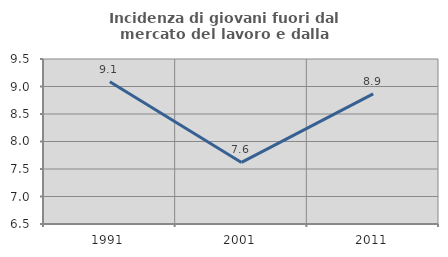
| Category | Incidenza di giovani fuori dal mercato del lavoro e dalla formazione  |
|---|---|
| 1991.0 | 9.088 |
| 2001.0 | 7.619 |
| 2011.0 | 8.865 |